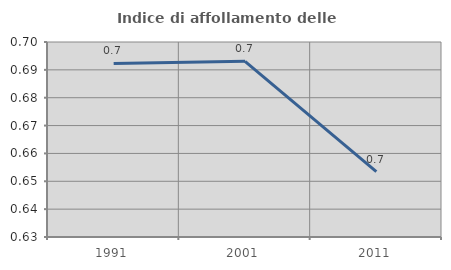
| Category | Indice di affollamento delle abitazioni  |
|---|---|
| 1991.0 | 0.692 |
| 2001.0 | 0.693 |
| 2011.0 | 0.653 |